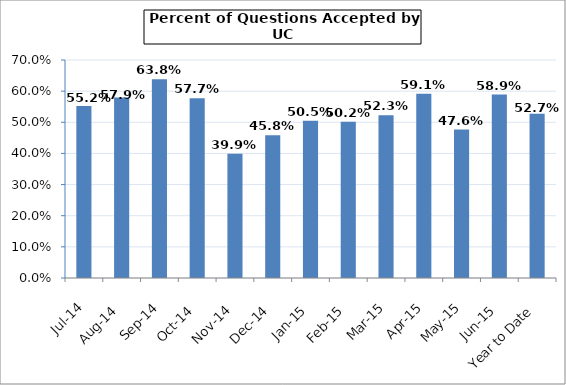
| Category | Series 0 |
|---|---|
| Jul-14 | 0.552 |
| Aug-14 | 0.579 |
| Sep-14 | 0.638 |
| Oct-14 | 0.577 |
| Nov-14 | 0.399 |
| Dec-14 | 0.458 |
| Jan-15 | 0.505 |
| Feb-15 | 0.502 |
| Mar-15 | 0.523 |
| Apr-15 | 0.591 |
| May-15 | 0.476 |
| Jun-15 | 0.589 |
| Year to Date | 0.527 |